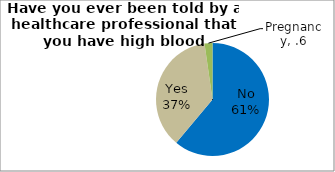
| Category | Series 0 |
|---|---|
| No | 61.091 |
| Yes | 36.639 |
| Pregnancy | 2.27 |